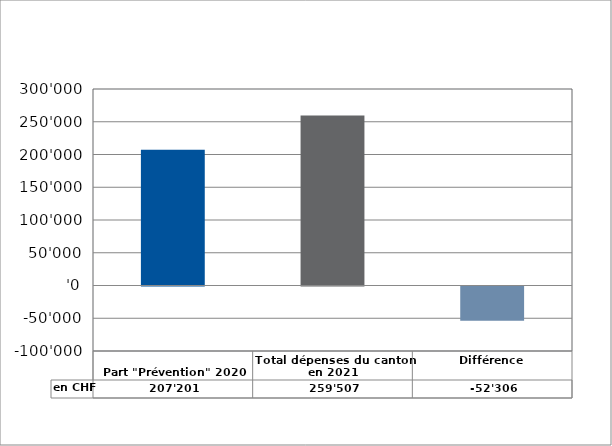
| Category | en CHF |
|---|---|
| 
Part "Prévention" 2020

 | 207201 |
| Total dépenses du canton en 2021 | 259507.25 |
| Différence | -52306.25 |